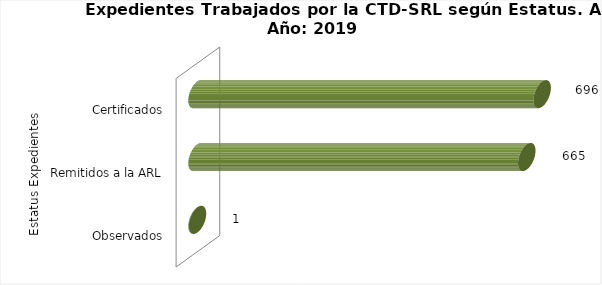
| Category | Total |
|---|---|
| 0 | 1 |
| 1 | 665 |
| 2 | 696 |